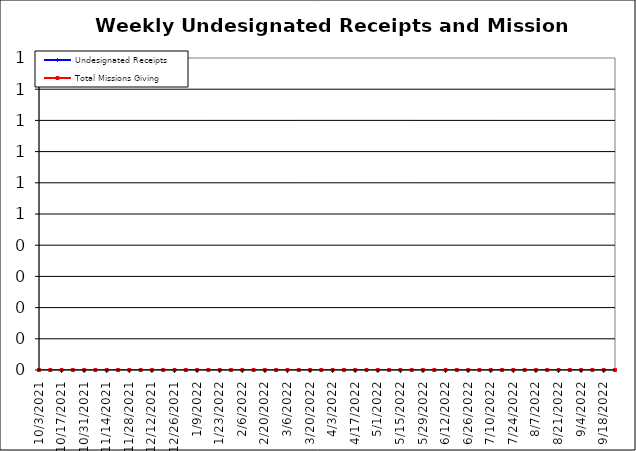
| Category | Undesignated Receipts | Total Missions Giving |
|---|---|---|
| 10/3/21 | 0 | 0 |
| 10/10/21 | 0 | 0 |
| 10/17/21 | 0 | 0 |
| 10/24/21 | 0 | 0 |
| 10/31/21 | 0 | 0 |
| 11/7/21 | 0 | 0 |
| 11/14/21 | 0 | 0 |
| 11/21/21 | 0 | 0 |
| 11/28/21 | 0 | 0 |
| 12/5/21 | 0 | 0 |
| 12/12/21 | 0 | 0 |
| 12/19/21 | 0 | 0 |
| 12/26/21 | 0 | 0 |
| 1/2/22 | 0 | 0 |
| 1/9/22 | 0 | 0 |
| 1/16/22 | 0 | 0 |
| 1/23/22 | 0 | 0 |
| 1/30/22 | 0 | 0 |
| 2/6/22 | 0 | 0 |
| 2/13/22 | 0 | 0 |
| 2/20/22 | 0 | 0 |
| 2/27/22 | 0 | 0 |
| 3/6/22 | 0 | 0 |
| 3/13/22 | 0 | 0 |
| 3/20/22 | 0 | 0 |
| 3/27/22 | 0 | 0 |
| 4/3/22 | 0 | 0 |
| 4/10/22 | 0 | 0 |
| 4/17/22 | 0 | 0 |
| 4/24/22 | 0 | 0 |
| 5/1/22 | 0 | 0 |
| 5/8/22 | 0 | 0 |
| 5/15/22 | 0 | 0 |
| 5/22/22 | 0 | 0 |
| 5/29/22 | 0 | 0 |
| 6/5/22 | 0 | 0 |
| 6/12/22 | 0 | 0 |
| 6/19/22 | 0 | 0 |
| 6/26/22 | 0 | 0 |
| 7/3/22 | 0 | 0 |
| 7/10/22 | 0 | 0 |
| 7/17/22 | 0 | 0 |
| 7/24/22 | 0 | 0 |
| 7/31/22 | 0 | 0 |
| 8/7/22 | 0 | 0 |
| 8/14/22 | 0 | 0 |
| 8/21/22 | 0 | 0 |
| 8/28/22 | 0 | 0 |
| 9/4/22 | 0 | 0 |
| 9/11/22 | 0 | 0 |
| 9/18/22 | 0 | 0 |
| 9/25/22 | 0 | 0 |